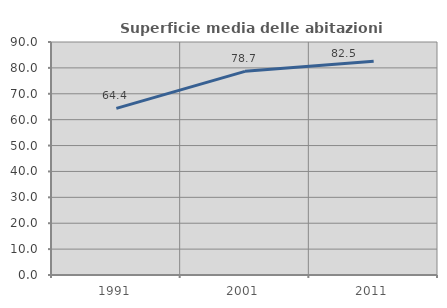
| Category | Superficie media delle abitazioni occupate |
|---|---|
| 1991.0 | 64.372 |
| 2001.0 | 78.674 |
| 2011.0 | 82.541 |